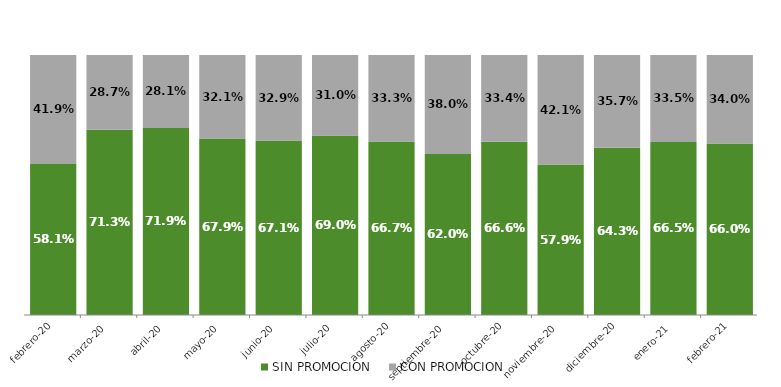
| Category | SIN PROMOCION   | CON PROMOCION   |
|---|---|---|
| 2020-02-01 | 0.581 | 0.419 |
| 2020-03-01 | 0.713 | 0.287 |
| 2020-04-01 | 0.719 | 0.281 |
| 2020-05-01 | 0.679 | 0.321 |
| 2020-06-01 | 0.671 | 0.329 |
| 2020-07-01 | 0.69 | 0.31 |
| 2020-08-01 | 0.667 | 0.333 |
| 2020-09-01 | 0.62 | 0.38 |
| 2020-10-01 | 0.666 | 0.334 |
| 2020-11-01 | 0.579 | 0.421 |
| 2020-12-01 | 0.643 | 0.357 |
| 2021-01-01 | 0.665 | 0.335 |
| 2021-02-01 | 0.66 | 0.34 |